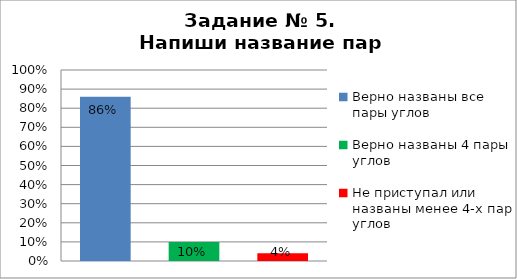
| Category | Напиши название пар углов |
|---|---|
| Верно названы все пары углов | 0.86 |
| Верно названы 4 пары углов | 0.1 |
| Не приступал или названы менее 4-х пар углов | 0.04 |